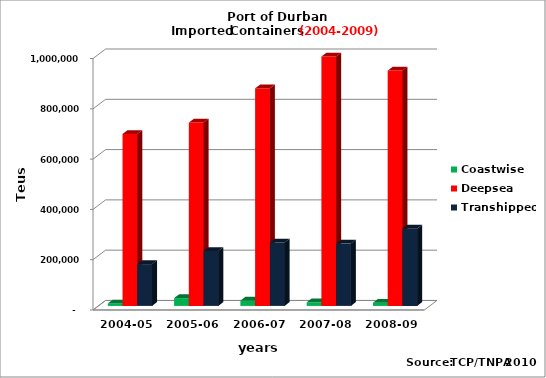
| Category | Coastwise | Deepsea | Transhipped |
|---|---|---|---|
| 2004-05 | 9702 | 683760 | 166255 |
| 2005-06 | 31104 | 729069 | 218294 |
| 2006-07 | 21028 | 865087 | 252088 |
| 2007-08 | 14342 | 991766 | 247721 |
| 2008-09 | 12447 | 935790 | 307343 |